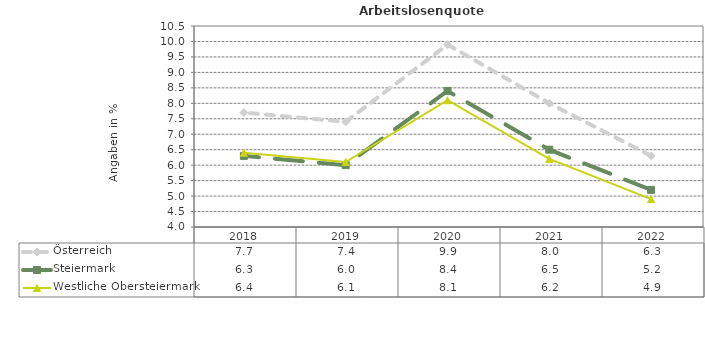
| Category | Österreich | Steiermark | Westliche Obersteiermark |
|---|---|---|---|
| 2022.0 | 6.3 | 5.2 | 4.9 |
| 2021.0 | 8 | 6.5 | 6.2 |
| 2020.0 | 9.9 | 8.4 | 8.1 |
| 2019.0 | 7.4 | 6 | 6.1 |
| 2018.0 | 7.7 | 6.3 | 6.4 |